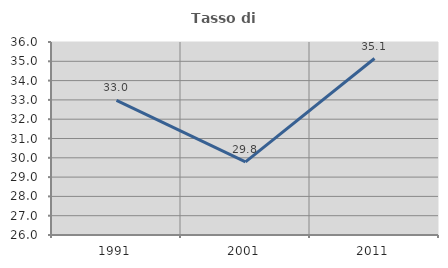
| Category | Tasso di occupazione   |
|---|---|
| 1991.0 | 32.97 |
| 2001.0 | 29.787 |
| 2011.0 | 35.143 |